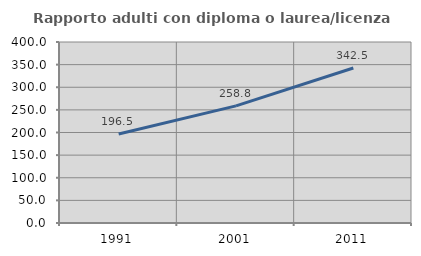
| Category | Rapporto adulti con diploma o laurea/licenza media  |
|---|---|
| 1991.0 | 196.507 |
| 2001.0 | 258.799 |
| 2011.0 | 342.481 |